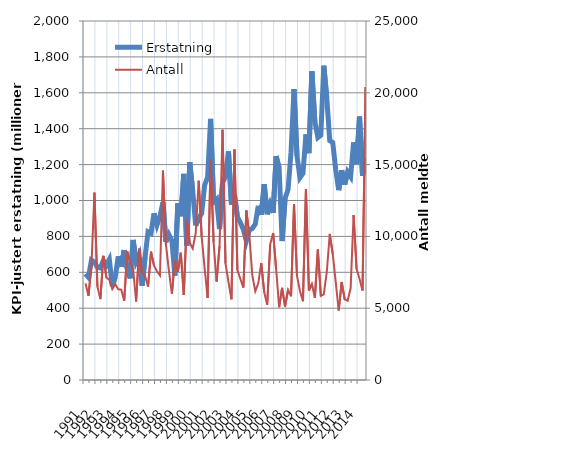
| Category | Erstatning |
|---|---|
| 1991.0 | 591.579 |
| nan | 572.287 |
| nan | 667.746 |
| nan | 656.396 |
| 1992.0 | 628.056 |
| nan | 624.045 |
| nan | 666.31 |
| nan | 639.591 |
| 1993.0 | 671.598 |
| nan | 521.577 |
| nan | 575.46 |
| nan | 688.697 |
| 1994.0 | 630.593 |
| nan | 723.392 |
| nan | 620.001 |
| nan | 566.075 |
| 1995.0 | 780.199 |
| nan | 659.448 |
| nan | 695.815 |
| nan | 524.742 |
| 1996.0 | 683.679 |
| nan | 825.944 |
| nan | 817.707 |
| nan | 927.833 |
| 1997.0 | 862.99 |
| nan | 912.615 |
| nan | 989.399 |
| nan | 769.195 |
| 1998.0 | 810.336 |
| nan | 776.529 |
| nan | 581.982 |
| nan | 984.311 |
| 1999.0 | 912.004 |
| nan | 1148.447 |
| nan | 748.195 |
| nan | 1212.986 |
| 2000.0 | 1051.918 |
| nan | 860.872 |
| nan | 900.019 |
| nan | 928.845 |
| 2001.0 | 1085.732 |
| nan | 1130.17 |
| nan | 1455.22 |
| nan | 991.747 |
| 2002.0 | 1007.298 |
| nan | 840.702 |
| nan | 1096.987 |
| nan | 1134.655 |
| 2003.0 | 1273.143 |
| nan | 977.282 |
| nan | 1031.625 |
| nan | 908.532 |
| 2004.0 | 876.233 |
| nan | 838.217 |
| nan | 775.153 |
| nan | 835.101 |
| 2005.0 | 844.15 |
| nan | 868.456 |
| nan | 970.181 |
| nan | 920.658 |
| 2006.0 | 1090.174 |
| nan | 923.351 |
| nan | 979.214 |
| nan | 931.506 |
| 2007.0 | 1247.432 |
| nan | 1181.709 |
| nan | 774.213 |
| nan | 1012.832 |
| 2008.0 | 1060.83 |
| nan | 1269.18 |
| nan | 1620.539 |
| nan | 1248.372 |
| 2009.0 | 1127.173 |
| nan | 1150.789 |
| nan | 1367.791 |
| nan | 1263.77 |
| 2010.0 | 1718.949 |
| nan | 1438.512 |
| nan | 1350.611 |
| nan | 1363.638 |
| 2011.0 | 1750.887 |
| nan | 1570.857 |
| nan | 1333.081 |
| nan | 1323.348 |
| 2012.0 | 1172.15 |
| nan | 1057.497 |
| nan | 1168.635 |
| nan | 1088.862 |
| 2013.0 | 1158.544 |
| nan | 1132.862 |
| nan | 1323.389 |
| nan | 1202.804 |
| 2014.0 | 1467.42 |
| nan | 1137.576 |
| nan | 1234.125 |